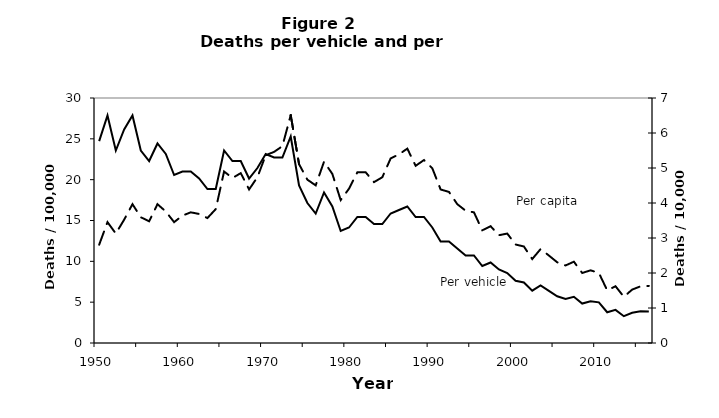
| Category | Series 0 |
|---|---|
| 1950.0 | 12.036 |
| 1951.0 | 14.8 |
| 1952.0 | 13.4 |
| 1953.0 | 15.1 |
| 1954.0 | 17 |
| 1955.0 | 15.4 |
| 1956.0 | 14.9 |
| 1957.0 | 17 |
| 1958.0 | 16.1 |
| 1959.0 | 14.8 |
| 1960.0 | 15.6 |
| 1961.0 | 16 |
| 1962.0 | 15.8 |
| 1963.0 | 15.3 |
| 1964.0 | 16.4 |
| 1965.0 | 21 |
| 1966.0 | 20.2 |
| 1967.0 | 20.8 |
| 1968.0 | 18.8 |
| 1969.0 | 20.3 |
| 1970.0 | 23 |
| 1971.0 | 23.4 |
| 1972.0 | 24.1 |
| 1973.0 | 27.9 |
| 1974.0 | 21.9 |
| 1975.0 | 20 |
| 1976.0 | 19.3 |
| 1977.0 | 22.2 |
| 1978.0 | 20.7 |
| 1979.0 | 17.5 |
| 1980.0 | 18.9 |
| 1981.0 | 20.9 |
| 1982.0 | 20.9 |
| 1983.0 | 19.7 |
| 1984.0 | 20.3 |
| 1985.0 | 22.6 |
| 1986.0 | 23.1 |
| 1987.0 | 23.8 |
| 1988.0 | 21.7 |
| 1989.0 | 22.4 |
| 1990.0 | 21.4 |
| 1991.0 | 18.8 |
| 1992.0 | 18.5 |
| 1993.0 | 17 |
| 1994.0 | 16.2 |
| 1995.0 | 16 |
| 1996.0 | 13.8 |
| 1997.0 | 14.3 |
| 1998.0 | 13.2 |
| 1999.0 | 13.4 |
| 2000.0 | 12.06 |
| 2001.0 | 11.818 |
| 2002.0 | 10.282 |
| 2003.0 | 11.499 |
| 2004.0 | 10.712 |
| 2005.0 | 9.882 |
| 2006.0 | 9.494 |
| 2007.0 | 9.957 |
| 2008.0 | 8.574 |
| 2009.0 | 8.898 |
| 2010.0 | 8.586 |
| 2011.0 | 6.447 |
| 2012.0 | 6.948 |
| 2013.0 | 5.659 |
| 2014.0 | 6.541 |
| 2015.0 | 6.94 |
| 2016.0 | 6.989 |